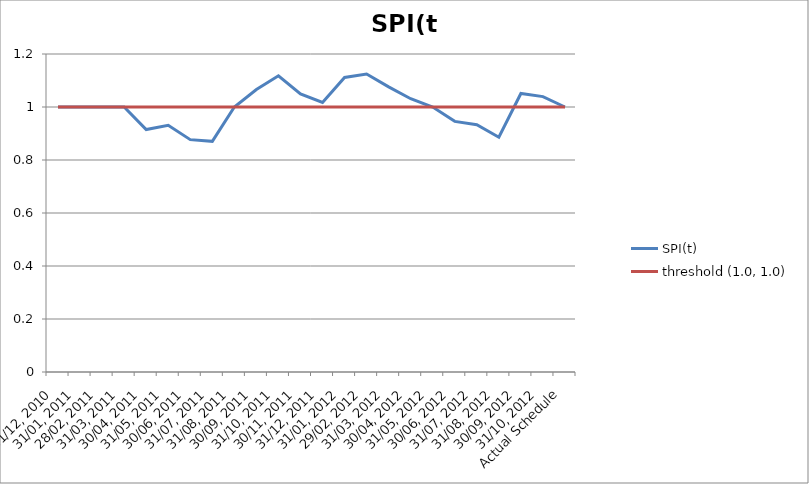
| Category | SPI(t) | threshold (1.0, 1.0) |
|---|---|---|
| 31/12, 2010 | 1 | 1 |
| 31/01, 2011 | 1 | 1 |
| 28/02, 2011 | 1 | 1 |
| 31/03, 2011 | 1 | 1 |
| 30/04, 2011 | 0.915 | 1 |
| 31/05, 2011 | 0.931 | 1 |
| 30/06, 2011 | 0.877 | 1 |
| 31/07, 2011 | 0.871 | 1 |
| 31/08, 2011 | 1 | 1 |
| 30/09, 2011 | 1.066 | 1 |
| 31/10, 2011 | 1.118 | 1 |
| 30/11, 2011 | 1.049 | 1 |
| 31/12, 2011 | 1.017 | 1 |
| 31/01, 2012 | 1.112 | 1 |
| 29/02, 2012 | 1.125 | 1 |
| 31/03, 2012 | 1.076 | 1 |
| 30/04, 2012 | 1.031 | 1 |
| 31/05, 2012 | 1 | 1 |
| 30/06, 2012 | 0.946 | 1 |
| 31/07, 2012 | 0.933 | 1 |
| 31/08, 2012 | 0.886 | 1 |
| 30/09, 2012 | 1.051 | 1 |
| 31/10, 2012 | 1.039 | 1 |
| Actual Schedule | 1 | 1 |